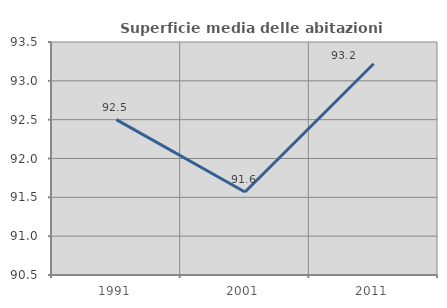
| Category | Superficie media delle abitazioni occupate |
|---|---|
| 1991.0 | 92.501 |
| 2001.0 | 91.569 |
| 2011.0 | 93.22 |